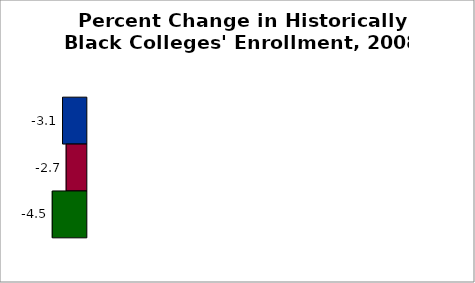
| Category | 50 states and D.C. | SREB states | State |
|---|---|---|---|
| 2008 to 2013 | -3.139 | -2.66 | -4.494 |